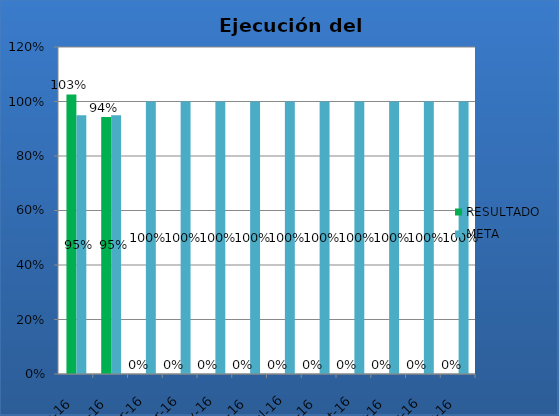
| Category | RESULTADO | META |
|---|---|---|
| ene-16 | 1.026 | 0.95 |
| feb-16 | 0.944 | 0.95 |
| mar-16 | 0 | 1 |
| abr-16 | 0 | 1 |
| may-16 | 0 | 1 |
| jun-16 | 0 | 1 |
| jul-16 | 0 | 1 |
| ago-16 | 0 | 1 |
| sep-16 | 0 | 1 |
| oct-16 | 0 | 1 |
| nov-16 | 0 | 1 |
| dic-16 | 0 | 1 |